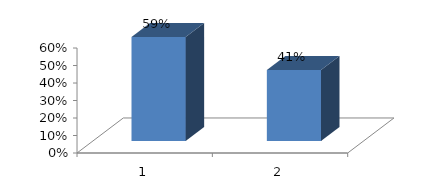
| Category | Series 0 |
|---|---|
| 0 | 0.595 |
| 1 | 0.405 |